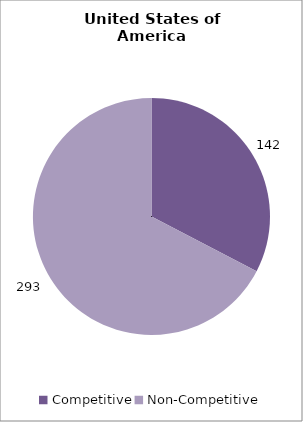
| Category | Series 0 |
|---|---|
| 0 | 142 |
| 1 | 293 |